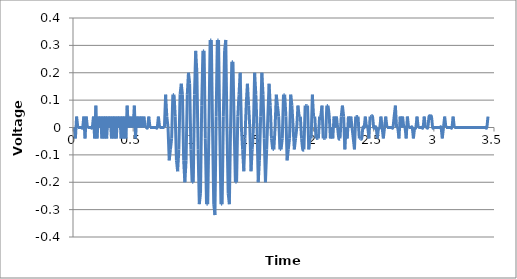
| Category | Series 0 |
|---|---|
| 0.01 | 0 |
| 0.02 | -0.04 |
| 0.03 | 0.04 |
| 0.04 | 0 |
| 0.05 | 0 |
| 0.060000000000000005 | 0 |
| 0.07 | 0 |
| 0.08 | 0 |
| 0.09 | 0.04 |
| 0.09999999999999999 | -0.04 |
| 0.10999999999999999 | 0.04 |
| 0.11999999999999998 | 0 |
| 0.12999999999999998 | 0 |
| 0.13999999999999999 | 0 |
| 0.15 | 0 |
| 0.16 | 0 |
| 0.17 | 0.04 |
| 0.18000000000000002 | -0.04 |
| 0.19000000000000003 | 0.08 |
| 0.20000000000000004 | -0.04 |
| 0.21000000000000005 | 0.04 |
| 0.22000000000000006 | 0 |
| 0.23000000000000007 | 0.04 |
| 0.24000000000000007 | -0.04 |
| 0.25000000000000006 | 0.04 |
| 0.26000000000000006 | -0.04 |
| 0.2700000000000001 | 0.04 |
| 0.2800000000000001 | -0.04 |
| 0.2900000000000001 | 0.04 |
| 0.3000000000000001 | 0 |
| 0.3100000000000001 | 0.04 |
| 0.3200000000000001 | -0.04 |
| 0.3300000000000001 | 0.04 |
| 0.34000000000000014 | -0.04 |
| 0.35000000000000014 | 0.04 |
| 0.36000000000000015 | -0.04 |
| 0.37000000000000016 | 0.04 |
| 0.38000000000000017 | 0 |
| 0.3900000000000002 | 0.04 |
| 0.4000000000000002 | -0.04 |
| 0.4100000000000002 | 0.04 |
| 0.4200000000000002 | -0.04 |
| 0.4300000000000002 | 0.04 |
| 0.4400000000000002 | -0.04 |
| 0.45000000000000023 | 0.08 |
| 0.46000000000000024 | 0 |
| 0.47000000000000025 | 0.04 |
| 0.48000000000000026 | 0 |
| 0.49000000000000027 | 0.04 |
| 0.5000000000000002 | 0 |
| 0.5100000000000002 | 0.08 |
| 0.5200000000000002 | -0.04 |
| 0.5300000000000002 | 0.04 |
| 0.5400000000000003 | 0 |
| 0.5500000000000003 | 0.04 |
| 0.5600000000000003 | 0 |
| 0.5700000000000003 | 0.04 |
| 0.5800000000000003 | 0 |
| 0.5900000000000003 | 0.04 |
| 0.6000000000000003 | 0 |
| 0.6100000000000003 | 0 |
| 0.6200000000000003 | 0 |
| 0.6300000000000003 | 0.04 |
| 0.6400000000000003 | 0 |
| 0.6500000000000004 | 0 |
| 0.6600000000000004 | 0 |
| 0.6700000000000004 | 0 |
| 0.6800000000000004 | 0 |
| 0.6900000000000004 | 0 |
| 0.7000000000000004 | 0 |
| 0.7100000000000004 | 0.04 |
| 0.7200000000000004 | 0 |
| 0.7300000000000004 | 0 |
| 0.7400000000000004 | 0 |
| 0.7500000000000004 | 0 |
| 0.7600000000000005 | 0 |
| 0.7700000000000005 | 0.12 |
| 0.7800000000000005 | 0.04 |
| 0.7900000000000005 | 0 |
| 0.8000000000000005 | -0.12 |
| 0.8100000000000005 | -0.08 |
| 0.8200000000000005 | -0.04 |
| 0.8300000000000005 | 0.12 |
| 0.8400000000000005 | 0.12 |
| 0.8500000000000005 | 0.04 |
| 0.8600000000000005 | -0.12 |
| 0.8700000000000006 | -0.16 |
| 0.8800000000000006 | -0.08 |
| 0.8900000000000006 | 0.12 |
| 0.9000000000000006 | 0.16 |
| 0.9100000000000006 | 0.12 |
| 0.9200000000000006 | -0.12 |
| 0.9300000000000006 | -0.2 |
| 0.9400000000000006 | -0.12 |
| 0.9500000000000006 | 0.12 |
| 0.9600000000000006 | 0.2 |
| 0.9700000000000006 | 0.16 |
| 0.9800000000000006 | -0.08 |
| 0.9900000000000007 | -0.2 |
| 1.0000000000000007 | -0.2 |
| 1.0100000000000007 | 0.12 |
| 1.0200000000000007 | 0.28 |
| 1.0300000000000007 | 0.2 |
| 1.0400000000000007 | -0.08 |
| 1.0500000000000007 | -0.28 |
| 1.0600000000000007 | -0.24 |
| 1.0700000000000007 | 0.08 |
| 1.0800000000000007 | 0.28 |
| 1.0900000000000007 | 0.28 |
| 1.1000000000000008 | -0.04 |
| 1.1100000000000008 | -0.28 |
| 1.1200000000000008 | -0.28 |
| 1.1300000000000008 | 0 |
| 1.1400000000000008 | 0.32 |
| 1.1500000000000008 | 0.32 |
| 1.1600000000000008 | 0 |
| 1.1700000000000008 | -0.28 |
| 1.1800000000000008 | -0.32 |
| 1.1900000000000008 | 0.04 |
| 1.2000000000000008 | 0.32 |
| 1.2100000000000009 | 0.32 |
| 1.2200000000000009 | 0 |
| 1.2300000000000009 | -0.28 |
| 1.2400000000000009 | -0.28 |
| 1.2500000000000009 | 0.04 |
| 1.260000000000001 | 0.28 |
| 1.270000000000001 | 0.32 |
| 1.280000000000001 | 0 |
| 1.290000000000001 | -0.24 |
| 1.300000000000001 | -0.28 |
| 1.310000000000001 | 0 |
| 1.320000000000001 | 0.24 |
| 1.330000000000001 | 0.24 |
| 1.340000000000001 | 0 |
| 1.350000000000001 | -0.2 |
| 1.360000000000001 | -0.2 |
| 1.370000000000001 | 0.04 |
| 1.380000000000001 | 0.12 |
| 1.390000000000001 | 0.2 |
| 1.400000000000001 | 0 |
| 1.410000000000001 | -0.08 |
| 1.420000000000001 | -0.16 |
| 1.430000000000001 | -0.04 |
| 1.440000000000001 | 0.08 |
| 1.450000000000001 | 0.16 |
| 1.460000000000001 | 0.08 |
| 1.470000000000001 | 0 |
| 1.480000000000001 | -0.16 |
| 1.490000000000001 | -0.08 |
| 1.500000000000001 | 0 |
| 1.5100000000000011 | 0.2 |
| 1.5200000000000011 | 0.12 |
| 1.5300000000000011 | 0 |
| 1.5400000000000011 | -0.2 |
| 1.5500000000000012 | -0.12 |
| 1.5600000000000012 | 0.04 |
| 1.5700000000000012 | 0.2 |
| 1.5800000000000012 | 0.12 |
| 1.5900000000000012 | -0.04 |
| 1.6000000000000012 | -0.2 |
| 1.6100000000000012 | -0.08 |
| 1.6200000000000012 | 0.04 |
| 1.6300000000000012 | 0.16 |
| 1.6400000000000012 | 0.08 |
| 1.6500000000000012 | -0.04 |
| 1.6600000000000013 | -0.08 |
| 1.6700000000000013 | -0.08 |
| 1.6800000000000013 | 0 |
| 1.6900000000000013 | 0.12 |
| 1.7000000000000013 | 0.08 |
| 1.7100000000000013 | 0.04 |
| 1.7200000000000013 | -0.08 |
| 1.7300000000000013 | -0.08 |
| 1.7400000000000013 | -0.04 |
| 1.7500000000000013 | 0.12 |
| 1.7600000000000013 | 0.12 |
| 1.7700000000000014 | 0.04 |
| 1.7800000000000014 | -0.12 |
| 1.7900000000000014 | -0.08 |
| 1.8000000000000014 | -0.04 |
| 1.8100000000000014 | 0.12 |
| 1.8200000000000014 | 0.08 |
| 1.8300000000000014 | 0 |
| 1.8400000000000014 | -0.08 |
| 1.8500000000000014 | -0.04 |
| 1.8600000000000014 | 0 |
| 1.8700000000000014 | 0.08 |
| 1.8800000000000014 | 0.04 |
| 1.8900000000000015 | 0.04 |
| 1.9000000000000015 | -0.04 |
| 1.9100000000000015 | -0.08 |
| 1.9200000000000015 | -0.08 |
| 1.9300000000000015 | 0.08 |
| 1.9400000000000015 | 0.08 |
| 1.9500000000000015 | 0.08 |
| 1.9600000000000015 | -0.08 |
| 1.9700000000000015 | -0.04 |
| 1.9800000000000015 | -0.04 |
| 1.9900000000000015 | 0.12 |
| 2.0000000000000013 | 0.04 |
| 2.010000000000001 | 0.04 |
| 2.020000000000001 | -0.04 |
| 2.0300000000000007 | -0.04 |
| 2.0400000000000005 | -0.04 |
| 2.0500000000000003 | 0.04 |
| 2.06 | 0.04 |
| 2.07 | 0.08 |
| 2.0799999999999996 | -0.04 |
| 2.0899999999999994 | -0.04 |
| 2.099999999999999 | -0.04 |
| 2.109999999999999 | 0.08 |
| 2.1199999999999988 | 0.08 |
| 2.1299999999999986 | 0.04 |
| 2.1399999999999983 | -0.04 |
| 2.149999999999998 | 0 |
| 2.159999999999998 | -0.04 |
| 2.1699999999999977 | 0.04 |
| 2.1799999999999975 | 0 |
| 2.1899999999999973 | 0.04 |
| 2.199999999999997 | 0 |
| 2.209999999999997 | -0.04 |
| 2.2199999999999966 | -0.04 |
| 2.2299999999999964 | 0.04 |
| 2.239999999999996 | 0.08 |
| 2.249999999999996 | 0.04 |
| 2.259999999999996 | -0.08 |
| 2.2699999999999956 | 0 |
| 2.2799999999999954 | -0.04 |
| 2.289999999999995 | 0.04 |
| 2.299999999999995 | 0 |
| 2.3099999999999947 | 0.04 |
| 2.3199999999999945 | 0 |
| 2.3299999999999943 | -0.04 |
| 2.339999999999994 | -0.08 |
| 2.349999999999994 | 0.04 |
| 2.3599999999999937 | 0.04 |
| 2.3699999999999934 | 0.04 |
| 2.3799999999999932 | -0.04 |
| 2.389999999999993 | -0.04 |
| 2.399999999999993 | -0.04 |
| 2.4099999999999926 | 0 |
| 2.4199999999999924 | 0 |
| 2.429999999999992 | 0.04 |
| 2.439999999999992 | 0 |
| 2.4499999999999917 | 0 |
| 2.4599999999999915 | -0.04 |
| 2.4699999999999913 | 0.04 |
| 2.479999999999991 | 0.04 |
| 2.489999999999991 | 0.04 |
| 2.4999999999999907 | 0 |
| 2.5099999999999905 | 0 |
| 2.5199999999999902 | 0 |
| 2.52999999999999 | -0.04 |
| 2.53999999999999 | 0 |
| 2.5499999999999896 | 0 |
| 2.5599999999999894 | 0.04 |
| 2.569999999999989 | 0 |
| 2.579999999999989 | -0.04 |
| 2.5899999999999888 | 0 |
| 2.5999999999999885 | 0.04 |
| 2.6099999999999883 | 0 |
| 2.619999999999988 | 0 |
| 2.629999999999988 | 0 |
| 2.6399999999999877 | 0 |
| 2.6499999999999875 | 0 |
| 2.6599999999999873 | 0 |
| 2.669999999999987 | 0.04 |
| 2.679999999999987 | 0.08 |
| 2.6899999999999866 | 0 |
| 2.6999999999999864 | 0 |
| 2.709999999999986 | -0.04 |
| 2.719999999999986 | 0.04 |
| 2.7299999999999858 | 0 |
| 2.7399999999999856 | 0.04 |
| 2.7499999999999853 | 0 |
| 2.759999999999985 | 0 |
| 2.769999999999985 | -0.04 |
| 2.7799999999999847 | 0.04 |
| 2.7899999999999845 | 0 |
| 2.7999999999999843 | 0 |
| 2.809999999999984 | 0 |
| 2.819999999999984 | 0 |
| 2.8299999999999836 | -0.04 |
| 2.8399999999999834 | 0 |
| 2.849999999999983 | 0 |
| 2.859999999999983 | 0.04 |
| 2.869999999999983 | 0 |
| 2.8799999999999826 | 0 |
| 2.8899999999999824 | 0 |
| 2.899999999999982 | 0 |
| 2.909999999999982 | 0 |
| 2.9199999999999817 | 0.04 |
| 2.9299999999999815 | 0 |
| 2.9399999999999813 | 0 |
| 2.949999999999981 | 0 |
| 2.959999999999981 | 0.04 |
| 2.9699999999999807 | 0.04 |
| 2.9799999999999804 | 0.04 |
| 2.9899999999999802 | 0 |
| 2.99999999999998 | 0 |
| 3.00999999999998 | 0 |
| 3.0199999999999796 | 0 |
| 3.0299999999999794 | 0 |
| 3.039999999999979 | 0 |
| 3.049999999999979 | 0 |
| 3.0599999999999787 | 0 |
| 3.0699999999999785 | -0.04 |
| 3.0799999999999783 | 0 |
| 3.089999999999978 | 0.04 |
| 3.099999999999978 | 0 |
| 3.1099999999999777 | 0 |
| 3.1199999999999775 | 0 |
| 3.1299999999999772 | 0 |
| 3.139999999999977 | 0 |
| 3.149999999999977 | 0 |
| 3.1599999999999766 | 0.04 |
| 3.1699999999999764 | 0 |
| 3.179999999999976 | 0 |
| 3.189999999999976 | 0 |
| 3.1999999999999758 | 0 |
| 3.2099999999999755 | 0 |
| 3.2199999999999753 | 0 |
| 3.229999999999975 | 0 |
| 3.239999999999975 | 0 |
| 3.2499999999999747 | 0 |
| 3.2599999999999745 | 0 |
| 3.2699999999999743 | 0 |
| 3.279999999999974 | 0 |
| 3.289999999999974 | 0 |
| 3.2999999999999736 | 0 |
| 3.3099999999999734 | 0 |
| 3.319999999999973 | 0 |
| 3.329999999999973 | 0 |
| 3.3399999999999728 | 0 |
| 3.3499999999999726 | 0 |
| 3.3599999999999723 | 0 |
| 3.369999999999972 | 0 |
| 3.379999999999972 | 0 |
| 3.3899999999999717 | 0 |
| 3.3999999999999715 | 0 |
| 3.4099999999999713 | 0 |
| 3.419999999999971 | 0 |
| 3.429999999999971 | 0 |
| 3.4399999999999706 | 0 |
| 3.4499999999999704 | 0.04 |